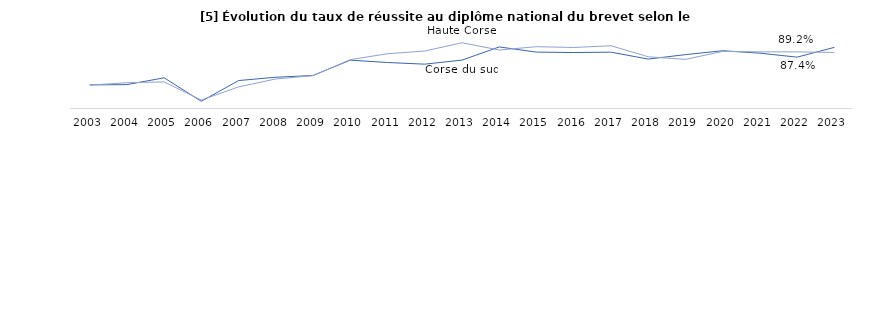
| Category | Corse du sud | Haute Corse |
|---|---|---|
| 2003 | 0.78 | 0.779 |
| 2004 | 0.781 | 0.787 |
| 2005 | 0.804 | 0.79 |
| 2006 | 0.724 | 0.729 |
| 2007 | 0.795 | 0.773 |
| 2008 | 0.806 | 0.8 |
| 2009 | 0.812 | 0.811 |
| 2010 | 0.864 | 0.866 |
| 2011 | 0.856 | 0.886 |
| 2012 | 0.85 | 0.895 |
| 2013 | 0.864 | 0.923 |
| 2014 | 0.909 | 0.898 |
| 2015 | 0.891 | 0.909 |
| 2016 | 0.89 | 0.907 |
| 2017 | 0.891 | 0.913 |
| 2018 | 0.868 | 0.875 |
| 2019 | 0.883 | 0.866 |
| 2020 | 0.896 | 0.893 |
| 2021 | 0.888 | 0.892 |
| 2022 | 0.874 | 0.892 |
| 2023 | 0.907 | 0.89 |